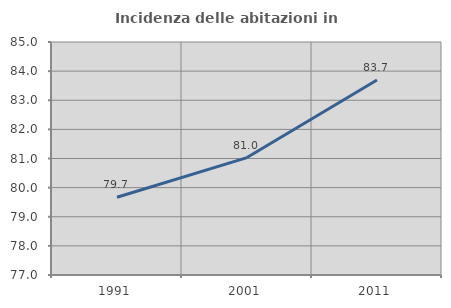
| Category | Incidenza delle abitazioni in proprietà  |
|---|---|
| 1991.0 | 79.669 |
| 2001.0 | 81.031 |
| 2011.0 | 83.693 |